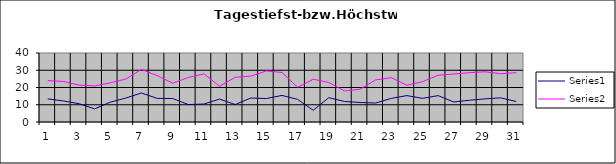
| Category | Series 0 | Series 1 |
|---|---|---|
| 0 | 13.4 | 24 |
| 1 | 12.2 | 23.5 |
| 2 | 10.6 | 21.4 |
| 3 | 7.6 | 20.9 |
| 4 | 11.5 | 22.7 |
| 5 | 13.9 | 24.9 |
| 6 | 16.8 | 30.5 |
| 7 | 13.7 | 26.9 |
| 8 | 13.6 | 22.5 |
| 9 | 10.1 | 25.8 |
| 10 | 10.4 | 27.9 |
| 11 | 13.3 | 20.7 |
| 12 | 10.1 | 25.9 |
| 13 | 13.9 | 26.6 |
| 14 | 13.6 | 29.6 |
| 15 | 15.4 | 28.7 |
| 16 | 13.1 | 20.1 |
| 17 | 6.8 | 24.8 |
| 18 | 14.1 | 22.9 |
| 19 | 11.9 | 18 |
| 20 | 11.3 | 19 |
| 21 | 11 | 24.4 |
| 22 | 13.7 | 25.7 |
| 23 | 15.3 | 21.3 |
| 24 | 13.7 | 23.4 |
| 25 | 15.3 | 27.1 |
| 26 | 11.6 | 27.8 |
| 27 | 12.6 | 28.6 |
| 28 | 13.4 | 29.1 |
| 29 | 14 | 28 |
| 30 | 11.9 | 28.6 |